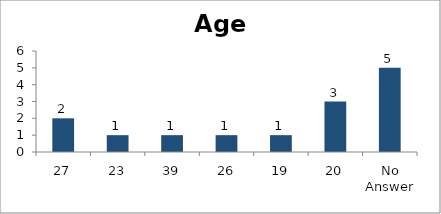
| Category | Age |
|---|---|
| 27 | 2 |
| 23 | 1 |
| 39 | 1 |
| 26 | 1 |
| 19 | 1 |
| 20 | 3 |
| No Answer | 5 |